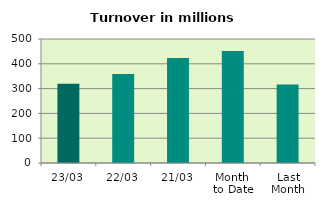
| Category | Series 0 |
|---|---|
| 23/03 | 319.569 |
| 22/03 | 358.583 |
| 21/03 | 423.392 |
| Month 
to Date | 451.839 |
| Last
Month | 316.082 |